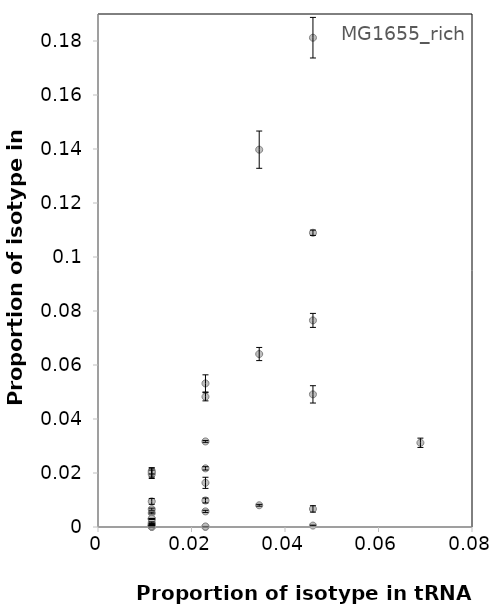
| Category | SBW25 |
|---|---|
| 0.022988505747126436 | 0.032 |
| 0.034482758620689655 | 0.064 |
| 0.04597701149425287 | 0.007 |
| 0.011494252873563218 | 0.001 |
| 0.011494252873563218 | 0 |
| 0.011494252873563218 | 0.003 |
| 0.04597701149425287 | 0.077 |
| 0.034482758620689655 | 0.14 |
| 0.011494252873563218 | 0.005 |
| 0.04597701149425287 | 0.001 |
| 0.022988505747126436 | 0.053 |
| 0.022988505747126436 | 0.048 |
| 0.04597701149425287 | 0.109 |
| 0.011494252873563218 | 0.007 |
| 0.04597701149425287 | 0.181 |
| 0.011494252873563218 | 0.02 |
| 0.011494252873563218 | 0 |
| 0.022988505747126436 | 0 |
| 0.034482758620689655 | 0.008 |
| 0.011494252873563218 | 0 |
| 0.04597701149425287 | 0.049 |
| 0.011494252873563218 | 0.002 |
| 0.011494252873563218 | 0 |
| 0.011494252873563218 | 0.009 |
| 0.06896551724137931 | 0.031 |
| 0.022988505747126436 | 0.01 |
| 0.022988505747126436 | 0 |
| 0.011494252873563218 | 0.001 |
| 0.011494252873563218 | 0.003 |
| 0.011494252873563218 | 0.003 |
| 0.011494252873563218 | 0 |
| 0.011494252873563218 | 0 |
| 0.011494252873563218 | 0.02 |
| 0.022988505747126436 | 0.022 |
| 0.011494252873563218 | 0.001 |
| 0.022988505747126436 | 0.006 |
| 0.022988505747126436 | 0.016 |
| 0.011494252873563218 | 0.021 |
| 0.011494252873563218 | 0 |